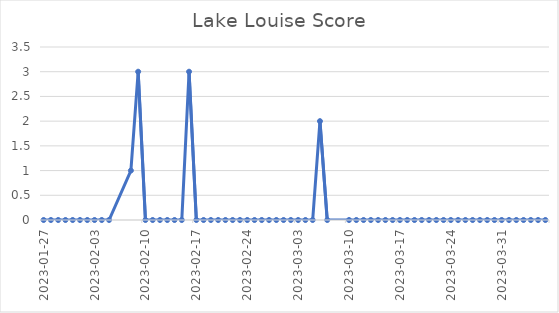
| Category | Lake Louse Score |
|---|---|
| 2023-01-27 | 0 |
| 2023-01-28 | 0 |
| 2023-01-29 | 0 |
| 2023-01-30 | 0 |
| 2023-01-31 | 0 |
| 2023-02-01 | 0 |
| 2023-02-02 | 0 |
| 2023-02-03 | 0 |
| 2023-02-04 | 0 |
| 2023-02-05 | 0 |
| 2023-02-08 | 1 |
| 2023-02-09 | 3 |
| 2023-02-10 | 0 |
| 2023-02-11 | 0 |
| 2023-02-12 | 0 |
| 2023-02-13 | 0 |
| 2023-02-14 | 0 |
| 2023-02-15 | 0 |
| 2023-02-16 | 3 |
| 2023-02-17 | 0 |
| 2023-02-18 | 0 |
| 2023-02-19 | 0 |
| 2023-02-20 | 0 |
| 2023-02-21 | 0 |
| 2023-02-22 | 0 |
| 2023-02-23 | 0 |
| 2023-02-24 | 0 |
| 2023-02-25 | 0 |
| 2023-02-26 | 0 |
| 2023-02-27 | 0 |
| 2023-02-28 | 0 |
| 2023-03-01 | 0 |
| 2023-03-02 | 0 |
| 2023-03-03 | 0 |
| 2023-03-04 | 0 |
| 2023-03-05 | 0 |
| 2023-03-06 | 2 |
| 2023-03-07 | 0 |
| 2023-03-10 | 0 |
| 2023-03-11 | 0 |
| 2023-03-12 | 0 |
| 2023-03-13 | 0 |
| 2023-03-14 | 0 |
| 2023-03-15 | 0 |
| 2023-03-16 | 0 |
| 2023-03-17 | 0 |
| 2023-03-18 | 0 |
| 2023-03-19 | 0 |
| 2023-03-20 | 0 |
| 2023-03-21 | 0 |
| 2023-03-22 | 0 |
| 2023-03-23 | 0 |
| 2023-03-24 | 0 |
| 2023-03-25 | 0 |
| 2023-03-26 | 0 |
| 2023-03-27 | 0 |
| 2023-03-28 | 0 |
| 2023-03-29 | 0 |
| 2023-03-30 | 0 |
| 2023-03-31 | 0 |
| 2023-04-01 | 0 |
| 2023-04-02 | 0 |
| 2023-04-03 | 0 |
| 2023-04-04 | 0 |
| 2023-04-05 | 0 |
| 2023-04-06 | 0 |